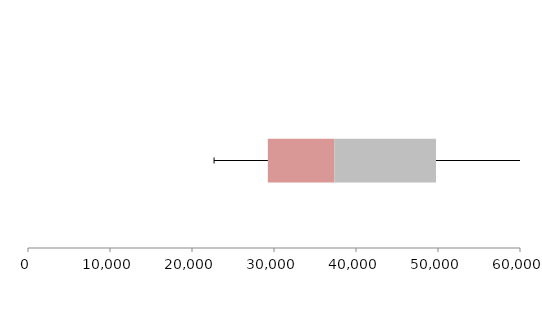
| Category | Series 1 | Series 2 | Series 3 |
|---|---|---|---|
| 0 | 29248.728 | 8095.819 | 12412.102 |